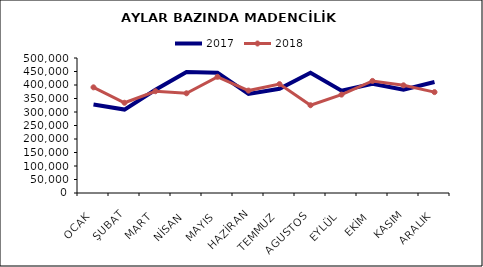
| Category | 2017 | 2018 |
|---|---|---|
| OCAK | 328015.231 | 391324.551 |
| ŞUBAT | 308981.734 | 334207.249 |
| MART | 382542.66 | 376898.408 |
| NİSAN | 448004.335 | 369344.332 |
| MAYIS | 445702.488 | 430283.598 |
| HAZİRAN | 366947.62 | 379336.432 |
| TEMMUZ | 385927.325 | 403232.97 |
| AGUSTOS | 445269.329 | 325034.335 |
| EYLÜL | 379084.852 | 364383.165 |
| EKİM | 404360.623 | 415097.305 |
| KASIM | 382916.867 | 398860.719 |
| ARALIK | 411301.417 | 373658.935 |